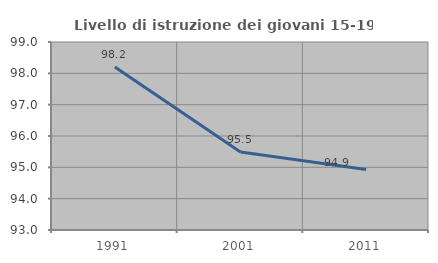
| Category | Livello di istruzione dei giovani 15-19 anni |
|---|---|
| 1991.0 | 98.204 |
| 2001.0 | 95.489 |
| 2011.0 | 94.932 |